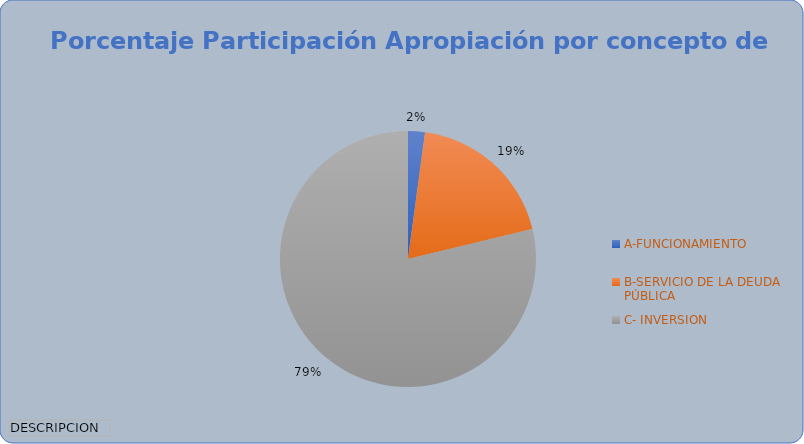
| Category | Total |
|---|---|
| A-FUNCIONAMIENTO | 100000.001 |
| B-SERVICIO DE LA DEUDA PÚBLICA | 896061 |
| C- INVERSION | 3691790.247 |